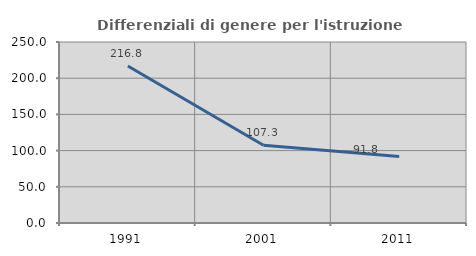
| Category | Differenziali di genere per l'istruzione superiore |
|---|---|
| 1991.0 | 216.812 |
| 2001.0 | 107.319 |
| 2011.0 | 91.786 |